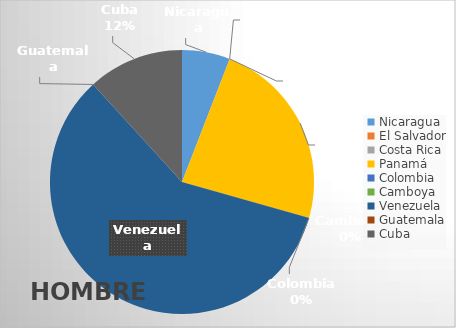
| Category | Series 0 |
|---|---|
| Nicaragua | 1 |
| El Salvador | 0 |
| Costa Rica | 0 |
| Panamá | 4 |
| Colombia  | 0 |
| Camboya | 0 |
| Venezuela | 10 |
| Guatemala | 0 |
| Cuba | 2 |